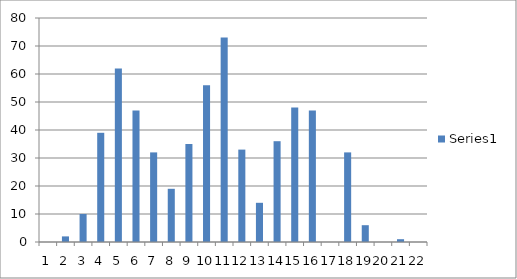
| Category | Series 0 |
|---|---|
| 0 | 0 |
| 1 | 2 |
| 2 | 10 |
| 3 | 39 |
| 4 | 62 |
| 5 | 47 |
| 6 | 32 |
| 7 | 19 |
| 8 | 35 |
| 9 | 56 |
| 10 | 73 |
| 11 | 33 |
| 12 | 14 |
| 13 | 36 |
| 14 | 48 |
| 15 | 47 |
| 16 | 0 |
| 17 | 32 |
| 18 | 6 |
| 19 | 0 |
| 20 | 1 |
| 21 | 0 |